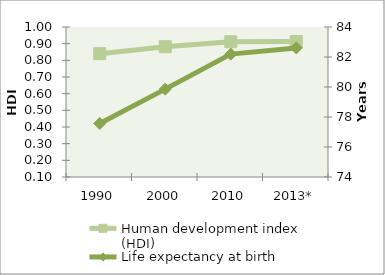
| Category | Human development index (HDI) |
|---|---|
| 1990 | 0.84 |
| 2000 | 0.882 |
| 2010 | 0.912 |
| 2013* | 0.913 |